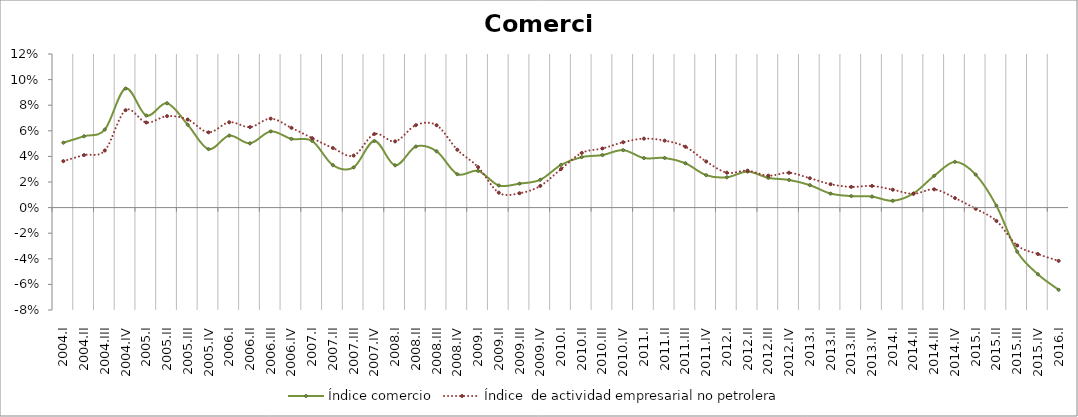
| Category | Índice comercio | Índice  de actividad empresarial no petrolera |
|---|---|---|
| 2004.I | 0.051 | 0.036 |
| 2004.II | 0.056 | 0.041 |
| 2004.III | 0.061 | 0.045 |
| 2004.IV | 0.093 | 0.076 |
| 2005.I | 0.072 | 0.066 |
| 2005.II | 0.082 | 0.071 |
| 2005.III | 0.065 | 0.069 |
| 2005.IV | 0.046 | 0.059 |
| 2006.I | 0.056 | 0.067 |
| 2006.II | 0.05 | 0.063 |
| 2006.III | 0.06 | 0.07 |
| 2006.IV | 0.054 | 0.062 |
| 2007.I | 0.052 | 0.054 |
| 2007.II | 0.033 | 0.047 |
| 2007.III | 0.031 | 0.041 |
| 2007.IV | 0.052 | 0.057 |
| 2008.I | 0.033 | 0.052 |
| 2008.II | 0.048 | 0.064 |
| 2008.III | 0.044 | 0.064 |
| 2008.IV | 0.026 | 0.045 |
| 2009.I | 0.029 | 0.032 |
| 2009.II | 0.017 | 0.012 |
| 2009.III | 0.019 | 0.011 |
| 2009.IV | 0.022 | 0.017 |
| 2010.I | 0.033 | 0.03 |
| 2010.II | 0.039 | 0.043 |
| 2010.III | 0.041 | 0.046 |
| 2010.IV | 0.045 | 0.051 |
| 2011.I | 0.039 | 0.054 |
| 2011.II | 0.039 | 0.052 |
| 2011.III | 0.035 | 0.048 |
| 2011.IV | 0.025 | 0.036 |
| 2012.I | 0.024 | 0.027 |
| 2012.II | 0.028 | 0.029 |
| 2012.III | 0.023 | 0.025 |
| 2012.IV | 0.022 | 0.027 |
| 2013.I | 0.018 | 0.023 |
| 2013.II | 0.011 | 0.018 |
| 2013.III | 0.009 | 0.016 |
| 2013.IV | 0.009 | 0.017 |
| 2014.I | 0.005 | 0.014 |
| 2014.II | 0.011 | 0.011 |
| 2014.III | 0.025 | 0.014 |
| 2014.IV | 0.036 | 0.007 |
| 2015.I | 0.026 | -0.001 |
| 2015.II | 0.001 | -0.01 |
| 2015.III | -0.034 | -0.03 |
| 2015.IV | -0.052 | -0.036 |
| 2016.I | -0.064 | -0.042 |